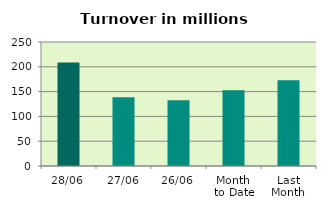
| Category | Series 0 |
|---|---|
| 28/06 | 208.433 |
| 27/06 | 138.563 |
| 26/06 | 132.745 |
| Month 
to Date | 152.535 |
| Last
Month | 173.133 |